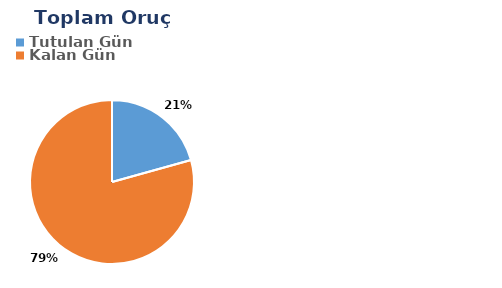
| Category | Toplam |
|---|---|
| Tutulan Gün | 6 |
| Kalan Gün | 23 |